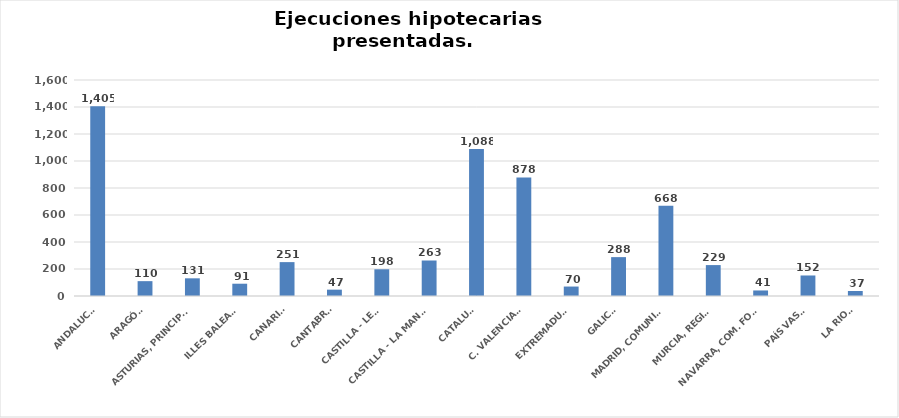
| Category | Series 0 |
|---|---|
| ANDALUCÍA | 1405 |
| ARAGÓN | 110 |
| ASTURIAS, PRINCIPADO | 131 |
| ILLES BALEARS | 91 |
| CANARIAS | 251 |
| CANTABRIA | 47 |
| CASTILLA - LEÓN | 198 |
| CASTILLA - LA MANCHA | 263 |
| CATALUÑA | 1088 |
| C. VALENCIANA | 878 |
| EXTREMADURA | 70 |
| GALICIA | 288 |
| MADRID, COMUNIDAD | 668 |
| MURCIA, REGIÓN | 229 |
| NAVARRA, COM. FORAL | 41 |
| PAÍS VASCO | 152 |
| LA RIOJA | 37 |